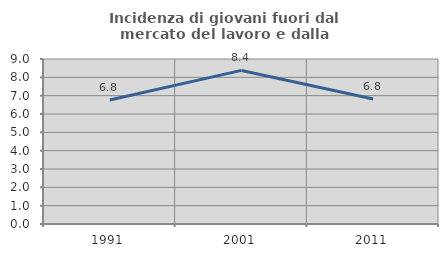
| Category | Incidenza di giovani fuori dal mercato del lavoro e dalla formazione  |
|---|---|
| 1991.0 | 6.767 |
| 2001.0 | 8.378 |
| 2011.0 | 6.814 |